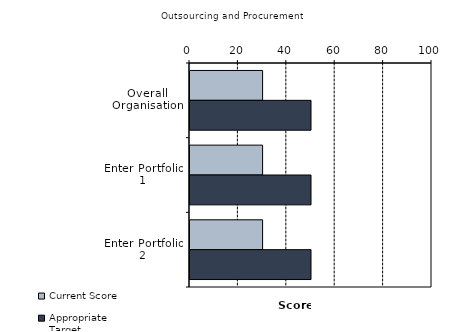
| Category | Current Score | Appropriate Target |
|---|---|---|
| Overall Organisation | 30 | 50 |
| Enter Portfolio 1 | 30 | 50 |
| Enter Portfolio 2 | 30 | 50 |